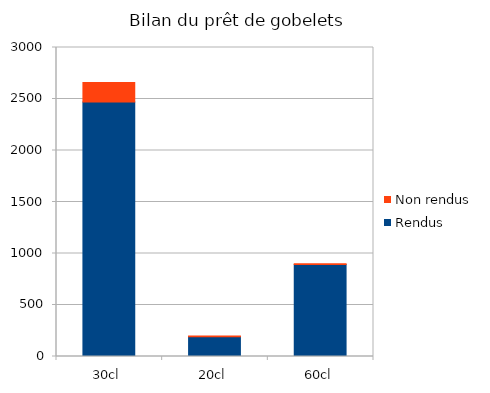
| Category | Rendus | Non rendus |
|---|---|---|
| 30cl | 2470 | 190 |
| 20cl | 192 | 8 |
| 60cl | 892 | 8 |